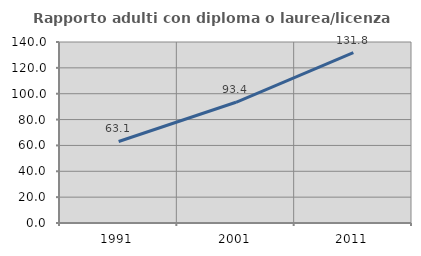
| Category | Rapporto adulti con diploma o laurea/licenza media  |
|---|---|
| 1991.0 | 63.072 |
| 2001.0 | 93.364 |
| 2011.0 | 131.818 |